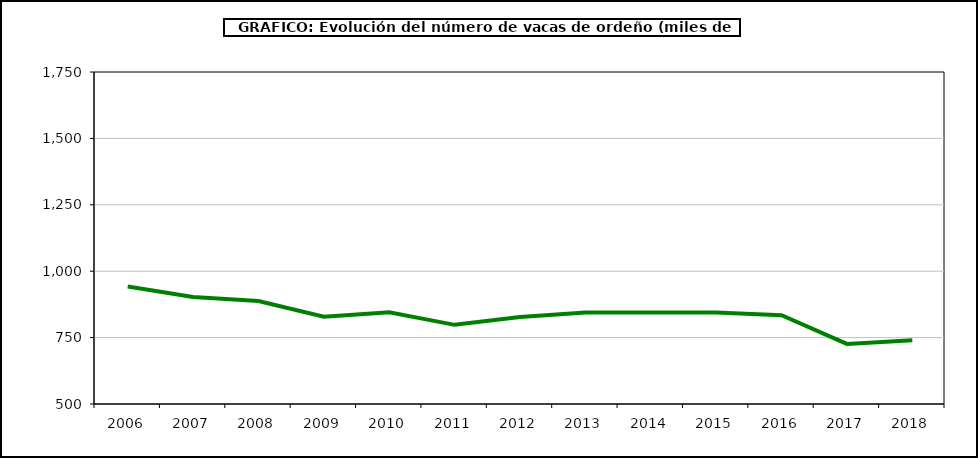
| Category | Leche de vaca |
|---|---|
| 2006.0 | 942.344 |
| 2007.0 | 903.287 |
| 2008.0 | 888 |
| 2009.0 | 828.347 |
| 2010.0 | 845 |
| 2011.0 | 798 |
| 2012.0 | 827.207 |
| 2013.0 | 844.06 |
| 2014.0 | 844.79 |
| 2015.0 | 844.114 |
| 2016.0 | 834.453 |
| 2017.0 | 726.131 |
| 2018.0 | 739.757 |